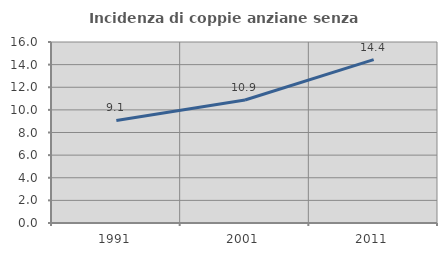
| Category | Incidenza di coppie anziane senza figli  |
|---|---|
| 1991.0 | 9.07 |
| 2001.0 | 10.87 |
| 2011.0 | 14.44 |